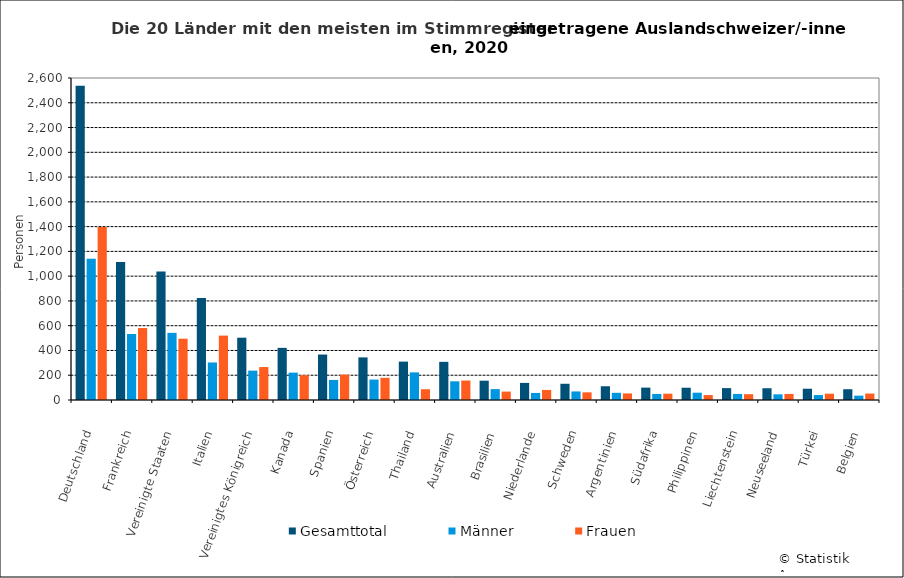
| Category | Gesamttotal | Männer | Frauen |
|---|---|---|---|
| Deutschland | 2537 | 1140 | 1397 |
| Frankreich | 1114 | 533 | 581 |
| Vereinigte Staaten | 1037 | 542 | 495 |
| Italien | 823 | 303 | 520 |
| Vereinigtes Königreich | 503 | 237 | 266 |
| Kanada | 421 | 221 | 200 |
| Spanien | 367 | 162 | 205 |
| Österreich | 344 | 165 | 179 |
| Thailand | 310 | 223 | 87 |
| Australien | 308 | 151 | 157 |
| Brasilien | 156 | 88 | 68 |
| Niederlande | 138 | 57 | 81 |
| Schweden | 131 | 69 | 62 |
| Argentinien | 111 | 58 | 53 |
| Südafrika | 100 | 49 | 51 |
| Philippinen | 99 | 59 | 40 |
| Liechtenstein | 96 | 49 | 47 |
| Neuseeland | 95 | 46 | 49 |
| Türkei | 91 | 40 | 51 |
| Belgien | 87 | 35 | 52 |